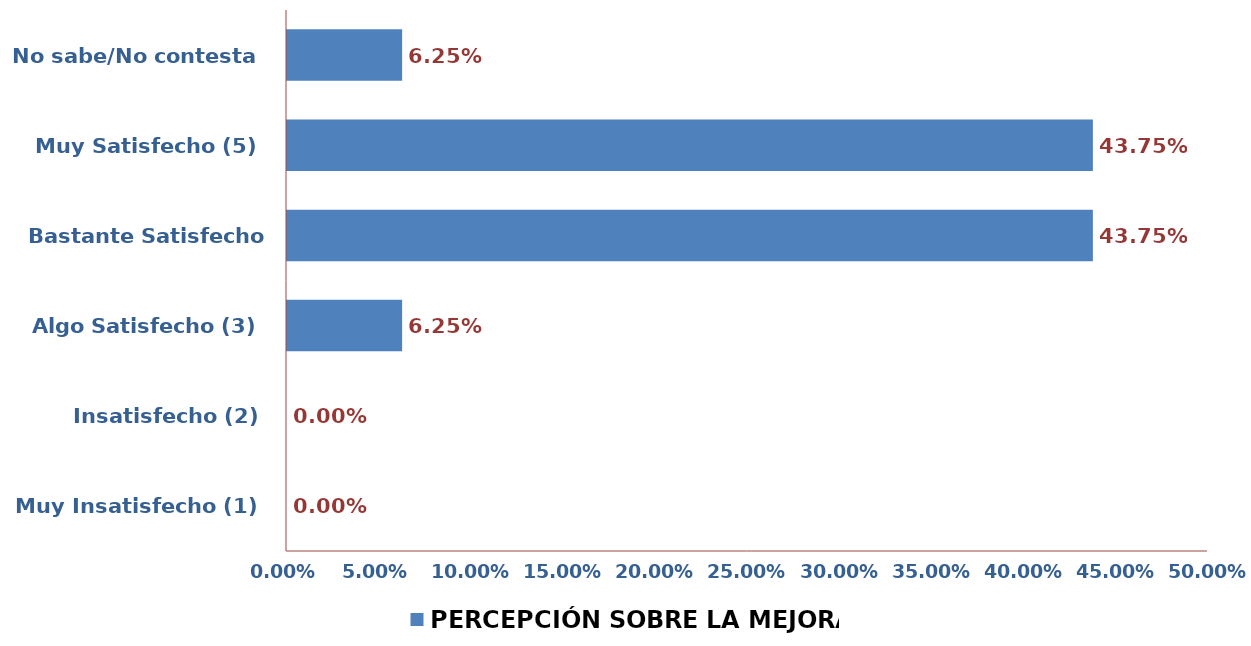
| Category | PERCEPCIÓN SOBRE LA MEJORA |
|---|---|
| Muy Insatisfecho (1) | 0 |
| Insatisfecho (2) | 0 |
| Algo Satisfecho (3) | 0.062 |
| Bastante Satisfecho (4) | 0.438 |
| Muy Satisfecho (5) | 0.438 |
| No sabe/No contesta | 0.062 |